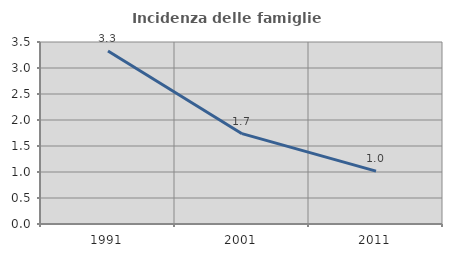
| Category | Incidenza delle famiglie numerose |
|---|---|
| 1991.0 | 3.327 |
| 2001.0 | 1.737 |
| 2011.0 | 1.017 |